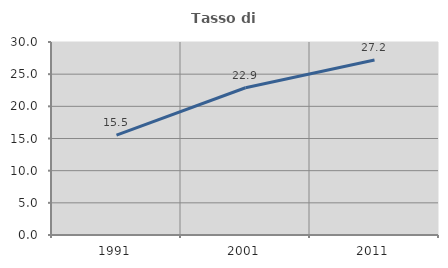
| Category | Tasso di occupazione   |
|---|---|
| 1991.0 | 15.538 |
| 2001.0 | 22.888 |
| 2011.0 | 27.207 |